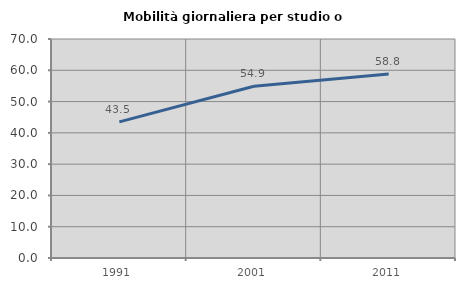
| Category | Mobilità giornaliera per studio o lavoro |
|---|---|
| 1991.0 | 43.519 |
| 2001.0 | 54.902 |
| 2011.0 | 58.779 |